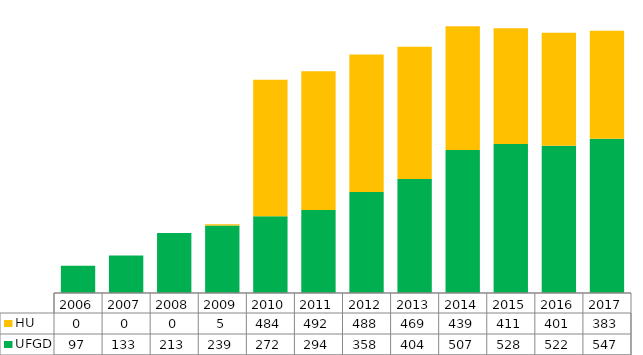
| Category | UFGD | HU |
|---|---|---|
| 2006.0 | 97 | 0 |
| 2007.0 | 133 | 0 |
| 2008.0 | 213 | 0 |
| 2009.0 | 239 | 5 |
| 2010.0 | 272 | 484 |
| 2011.0 | 294 | 492 |
| 2012.0 | 358 | 488 |
| 2013.0 | 404 | 469 |
| 2014.0 | 507 | 439 |
| 2015.0 | 528 | 411 |
| 2016.0 | 522 | 401 |
| 2017.0 | 547 | 383 |